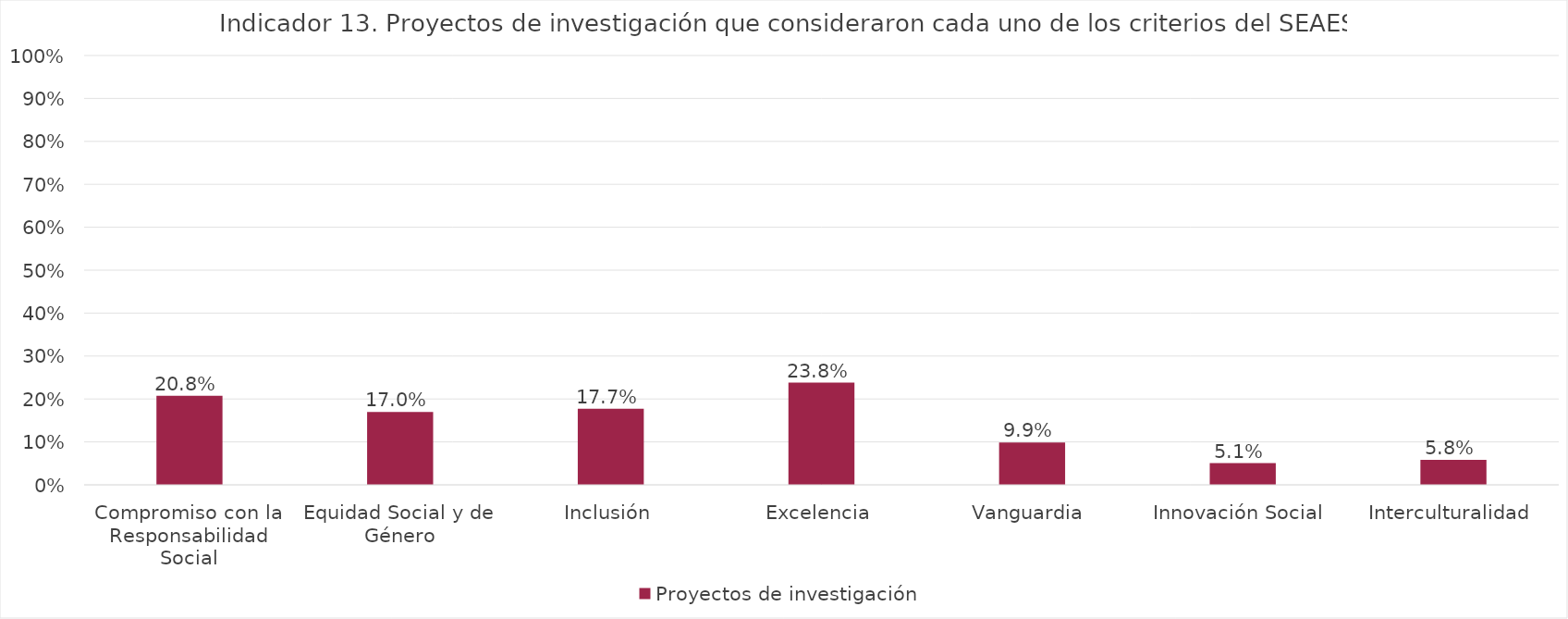
| Category | Proyectos de investigación |
|---|---|
| Compromiso con la Responsabilidad Social | 0.208 |
| Equidad Social y de Género | 0.17 |
| Inclusión | 0.177 |
| Excelencia | 0.238 |
| Vanguardia | 0.099 |
| Innovación Social | 0.051 |
| Interculturalidad | 0.058 |